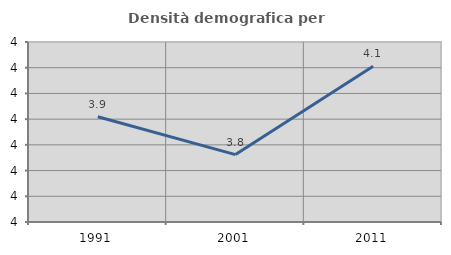
| Category | Densità demografica |
|---|---|
| 1991.0 | 3.909 |
| 2001.0 | 3.762 |
| 2011.0 | 4.106 |